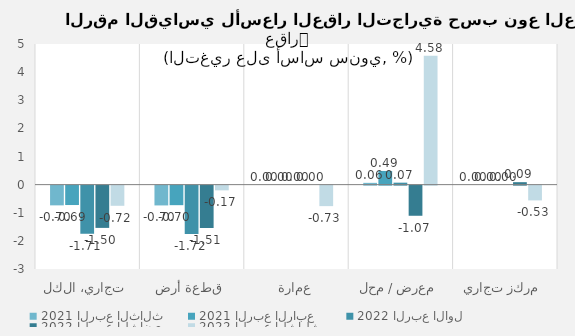
| Category | 2021 | 2022 |
|---|---|---|
| تجاري، الكل | -0.69 | -0.717 |
| قطعة أرض | -0.695 | -0.168 |
| عمارة | 0 | -0.729 |
| معرض / محل | 0.486 | 4.583 |
| مركز تجاري | 0 | -0.525 |